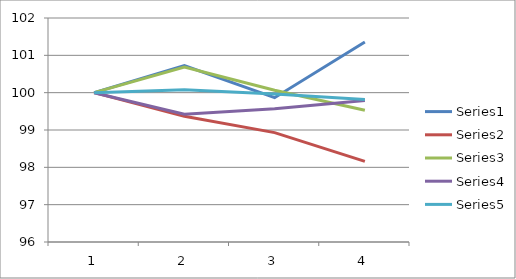
| Category | Series 0 | Series 1 | Series 2 | Series 3 | Series 4 |
|---|---|---|---|---|---|
| 0 | 100 | 100 | 100 | 100 | 100 |
| 1 | 100.723 | 99.369 | 100.687 | 99.424 | 100.076 |
| 2 | 99.866 | 98.929 | 100.065 | 99.568 | 99.963 |
| 3 | 101.357 | 98.16 | 99.531 | 99.791 | 99.816 |